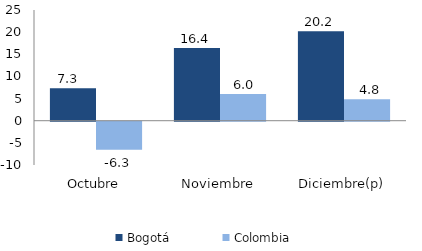
| Category | Bogotá | Colombia |
|---|---|---|
| Octubre | 7.349 | -6.306 |
| Noviembre | 16.447 | 6.046 |
| Diciembre(p) | 20.185 | 4.841 |